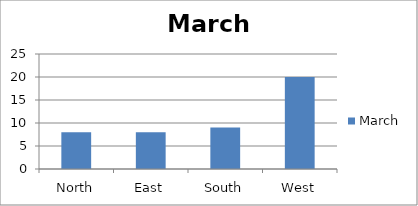
| Category | March |
|---|---|
| North | 8 |
| East | 8 |
| South | 9 |
| West | 20 |